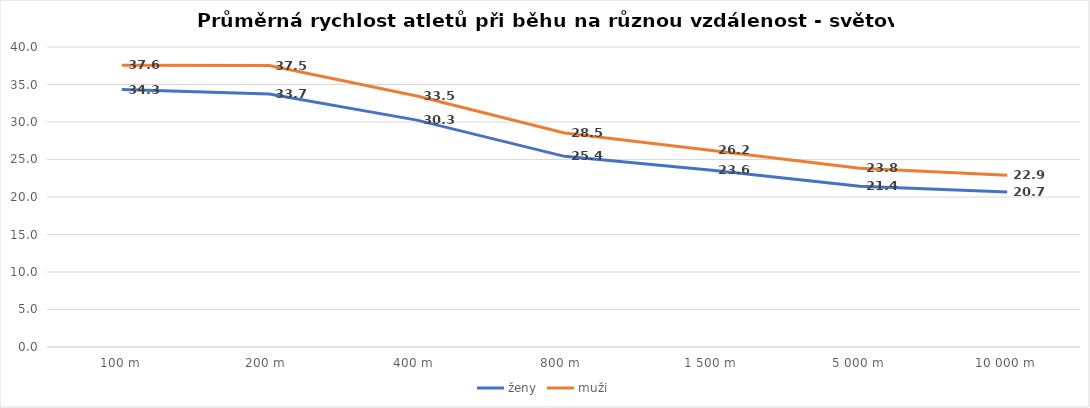
| Category | ženy | muži |
|---|---|---|
| 100 m | 34.318 | 37.578 |
| 200 m  | 33.739 | 37.52 |
| 400 m  | 30.252 | 33.465 |
| 800 m  | 25.419 | 28.543 |
| 1 500 m | 23.57 | 26.214 |
| 5 000 m | 21.423 | 23.828 |
| 10 000 m | 20.678 | 22.915 |